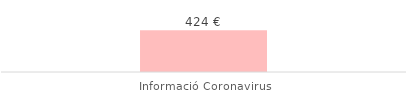
| Category | Total |
|---|---|
| Informació Coronavirus | 423.5 |